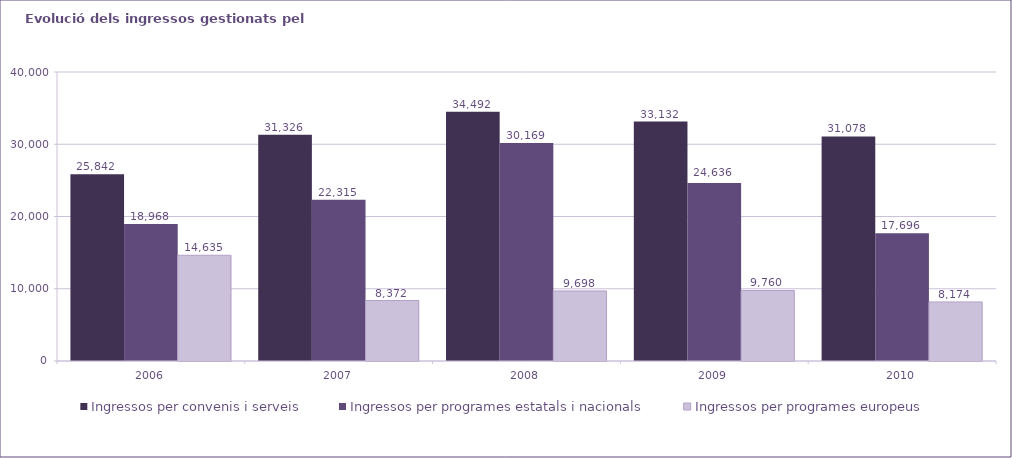
| Category | Ingressos per convenis i serveis | Ingressos per programes estatals i nacionals | Ingressos per programes europeus |
|---|---|---|---|
| 2006.0 | 25842 | 18968 | 14635 |
| 2007.0 | 31326 | 22315 | 8372 |
| 2008.0 | 34492 | 30169 | 9698 |
| 2009.0 | 33132 | 24636 | 9760 |
| 2010.0 | 31078 | 17696 | 8174 |